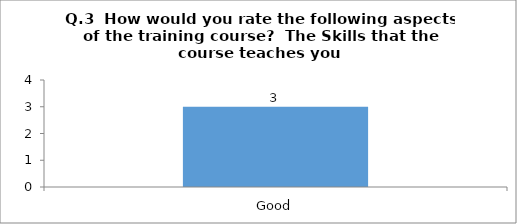
| Category | Q.3  How would you rate the following aspects of the training course?  |
|---|---|
| Good | 3 |